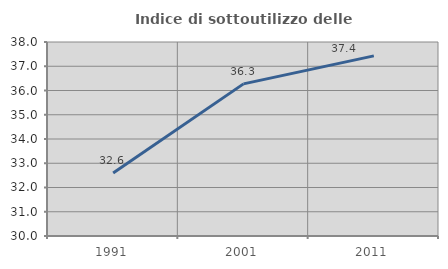
| Category | Indice di sottoutilizzo delle abitazioni  |
|---|---|
| 1991.0 | 32.596 |
| 2001.0 | 36.273 |
| 2011.0 | 37.427 |